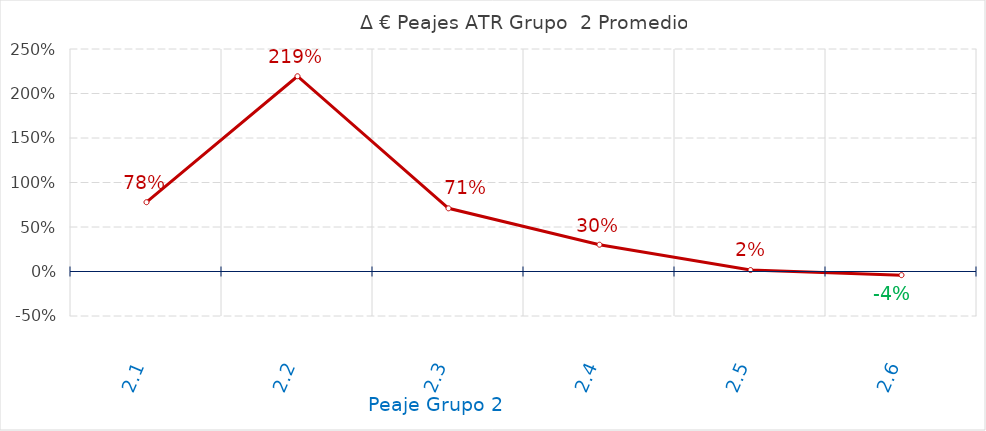
| Category | D €/año |
|---|---|
| 2.1 | 0.779 |
| 2.2 | 2.194 |
| 2.3 | 0.71 |
| 2.4 | 0.301 |
| 2.5 | 0.016 |
| 2.6 | -0.041 |